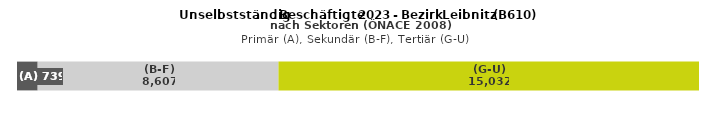
| Category | (A) | (B-F) | (G-U) |
|---|---|---|---|
| 0 | 739 | 8607 | 15032 |